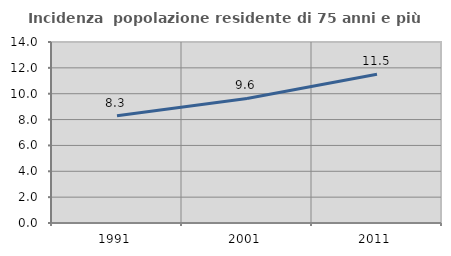
| Category | Incidenza  popolazione residente di 75 anni e più |
|---|---|
| 1991.0 | 8.296 |
| 2001.0 | 9.636 |
| 2011.0 | 11.511 |